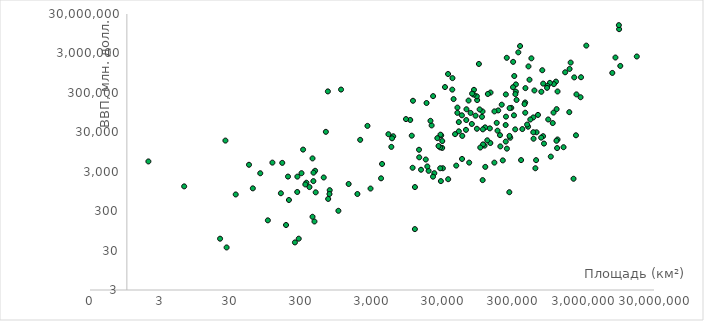
| Category | Series 0 |
|---|---|
| 17098246.0 | 2509000 |
| 9976140.0 | 1446000 |
| 9598077.0 | 12380000 |
| 9518900.0 | 15660000 |
| 8511965.0 | 2362000 |
| 7686850.0 | 960700 |
| 3287590.0 | 4735000 |
| 2766890.0 | 746900 |
| 2724900.0 | 232300 |
| 2381740.0 | 274500 |
| 2345410.0 | 25190 |
| 2218000.0 | 740500 |
| 2166086.0 | 1989 |
| 1972550.0 | 1758000 |
| 1904556.0 | 1212000 |
| 1886065.0 | 97210 |
| 1648000.0 | 997400 |
| 1564116.0 | 12550 |
| 1285220.0 | 325400 |
| 1284000.0 | 19690 |
| 1267000.0 | 11930 |
| 1246700.0 | 115900 |
| 1240000.0 | 18260 |
| 1219912.0 | 578600 |
| 1138910.0 | 500000 |
| 1127127.0 | 94760 |
| 1098580.0 | 51410 |
| 1030700.0 | 7242 |
| 1001450.0 | 537800 |
| 948087.0 | 63440 |
| 923768.0 | 450500 |
| 912050.0 | 402100 |
| 825418.0 | 15500 |
| 803940.0 | 514600 |
| 801590.0 | 23870 |
| 780580.0 | 1125000 |
| 756950.0 | 319400 |
| 752614.0 | 21930 |
| 678500.0 | 82720 |
| 647500.0 | 29990 |
| 637657.0 | 5896 |
| 622984.0 | 3672 |
| 603700.0 | 344700 |
| 587040.0 | 20600 |
| 582650.0 | 71500 |
| 581730.0 | 30090 |
| 547030.0 | 2253000 |
| 527970.0 | 63240 |
| 514000.0 | 646100 |
| 497304.0 | 1407000 |
| 491200.0 | 41510 |
| 475440.0 | 47120 |
| 449964.0 | 395800 |
| 447400.0 | 94040 |
| 446550.0 | 171000 |
| 437072.0 | 155400 |
| 406750.0 | 36210 |
| 390580.0 | 5916 |
| 377835.0 | 4617000 |
| 357021.0 | 3194000 |
| 337030.0 | 198100 |
| 329750.0 | 492000 |
| 329560.0 | 320500 |
| 324220.0 | 278100 |
| 322460.0 | 35600 |
| 312685.0 | 802000 |
| 309500.0 | 80890 |
| 301340.0 | 1834000 |
| 300000.0 | 416700 |
| 283560.0 | 124800 |
| 274200.0 | 21830 |
| 268680.0 | 123300 |
| 267667.0 | 24280 |
| 266000.0 | 906.5 |
| 245857.0 | 11530 |
| 244820.0 | 2323000 |
| 238540.0 | 74770 |
| 237500.0 | 274100 |
| 236800.0 | 17440 |
| 236040.0 | 45900 |
| 214970.0 | 5814 |
| 207600.0 | 150300 |
| 198500.0 | 13160 |
| 196190.0 | 25400 |
| 185180.0 | 107600 |
| 181040.0 | 32950 |
| 176220.0 | 52020 |
| 163610.0 | 101700 |
| 163270.0 | 5100 |
| 144000.0 | 305500 |
| 143100.0 | 16010 |
| 140800.0 | 37740 |
| 131940.0 | 280800 |
| 129494.0 | 18770 |
| 121320.0 | 3978 |
| 120540.0 | 40000 |
| 118480.0 | 13770 |
| 112620.0 | 14790 |
| 112090.0 | 35600 |
| 111370.0 | 1836 |
| 110910.0 | 101200 |
| 108890.0 | 73950 |
| 103000.0 | 12330 |
| 100860.0 | 114100 |
| 98480.0 | 1622000 |
| 93030.0 | 196800 |
| 92082.0 | 245000 |
| 92300.0 | 36820 |
| 88361.0 | 79090 |
| 83871.0 | 357800 |
| 82880.0 | 271200 |
| 78866.0 | 286700 |
| 78200.0 | 48760 |
| 75100.0 | 93020 |
| 71740.0 | 5100 |
| 70273.0 | 191500 |
| 65610.0 | 115100 |
| 65200.0 | 61300 |
| 64589.0 | 34580 |
| 57200.0 | 24280 |
| 56785.0 | 6324 |
| 56542.0 | 80890 |
| 51129.0 | 31720 |
| 51100.0 | 54470 |
| 48845.0 | 126900 |
| 48730.0 | 93230 |
| 47000.0 | 4284 |
| 45226.0 | 26930 |
| 43094.0 | 208500 |
| 41526.0 | 709500 |
| 41290.0 | 362400 |
| 36120.0 | 1938 |
| 35980.0 | 901900 |
| 32545.0 | 420600 |
| 30355.0 | 3672 |
| 29743.0 | 17950 |
| 29680.0 | 12040 |
| 28748.0 | 24990 |
| 28450.0 | 1734 |
| 28051.0 | 26110 |
| 27830.0 | 3672 |
| 27750.0 | 12440 |
| 26338.0 | 13460 |
| 25333.0 | 21320 |
| 22966.0 | 2754 |
| 22072.0 | 247900 |
| 22000.0 | 2244 |
| 21040.0 | 44780 |
| 20253.0 | 58560 |
| 19060.0 | 3158 |
| 18270.0 | 4080 |
| 17820.0 | 165900 |
| 17363.0 | 6120 |
| 14874.0 | 3366 |
| 14026.0 | 6957 |
| 13940.0 | 10810 |
| 12200.0 | 1224 |
| 12173.0 | 105.1 |
| 11437.0 | 189000 |
| 11300.0 | 3774 |
| 10990.0 | 24580 |
| 10452.0 | 61610 |
| 9104.0 | 64840 |
| 6000.0 | 23770 |
| 5770.0 | 21110 |
| 5640.0 | 12790 |
| 5128.0 | 26830 |
| 4167.0 | 4718 |
| 4033.0 | 2040 |
| 2860.0 | 1122 |
| 2586.0 | 43550 |
| 2040.0 | 19280 |
| 1862.0 | 816 |
| 1399.0 | 1465 |
| 1092.0 | 363700 |
| 1001.0 | 306 |
| 754.0 | 1020 |
| 748.0 | 816 |
| 717.0 | 612 |
| 710.0 | 326700 |
| 665.0 | 30800 |
| 620.0 | 2142 |
| 477.0 | 900 |
| 468.0 | 3169 |
| 458.0 | 164 |
| 444.0 | 2838 |
| 442.0 | 1734 |
| 430.0 | 6528 |
| 430.0 | 216 |
| 389.0 | 1224 |
| 352.0 | 1577 |
| 340.0 | 1428 |
| 316.0 | 10910 |
| 300.0 | 2754 |
| 274.0 | 60 |
| 262.0 | 2250 |
| 261.0 | 918 |
| 242.0 | 48.3 |
| 199.0 | 575.3 |
| 193.0 | 2258 |
| 181.0 | 133.5 |
| 160.0 | 5028 |
| 153.0 | 853.4 |
| 116.0 | 5100 |
| 100.0 | 175.4 |
| 78.0 | 2742 |
| 61.2 | 1136 |
| 54.0 | 4500 |
| 35.0 | 794.7 |
| 26.0 | 36 |
| 25.0 | 18470 |
| 21.0 | 60 |
| 6.5 | 1275 |
| 2.02 | 5470 |